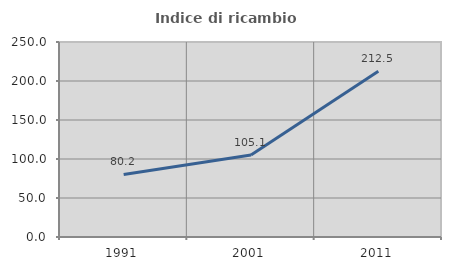
| Category | Indice di ricambio occupazionale  |
|---|---|
| 1991.0 | 80.22 |
| 2001.0 | 105.063 |
| 2011.0 | 212.5 |